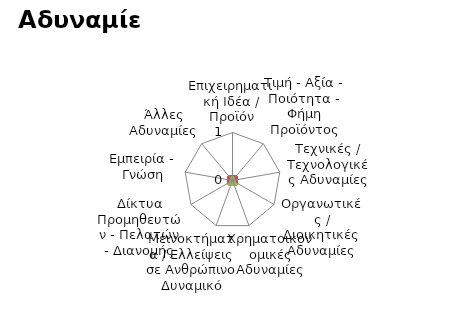
| Category | Weaknesses |
|---|---|
| Επιχειρηματική Ιδέα / Προϊόν | 3 |
| Τιμή - Αξία - Ποιότητα - Φήμη Προϊόντος | 2 |
| Τεχνικές / Τεχνολογικές Αδυναμίες | 1 |
| Οργανωτικές / Διοικητικές Αδυναμίες | 3 |
| Χρηματοικονομικές Αδυναμίες | 4 |
| Μεινοκτήματα / Ελλείψεις σε Ανθρώπινο Δυναμικό | 4 |
| Δίκτυα Προμηθευτών - Πελατών - Διανομής | 5 |
| Εμπειρία - Γνώση | 2 |
| Άλλες Αδυναμίες | 5 |